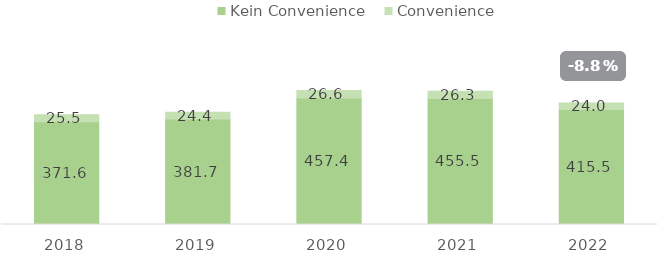
| Category | Kein Convenience | Convenience |
|---|---|---|
| 2018.0 | 371.594 | 25.535 |
| 2019.0 | 381.664 | 24.445 |
| 2020.0 | 457.377 | 26.612 |
| 2021.0 | 455.456 | 26.339 |
| 2022.0 | 415.499 | 23.983 |